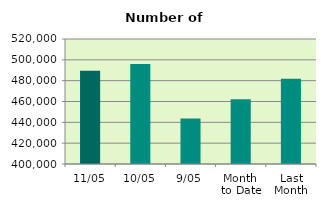
| Category | Series 0 |
|---|---|
| 11/05 | 489486 |
| 10/05 | 496052 |
| 9/05 | 443780 |
| Month 
to Date | 462158.25 |
| Last
Month | 481931.444 |